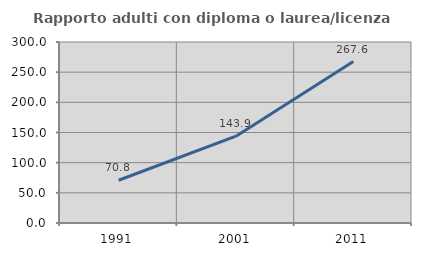
| Category | Rapporto adulti con diploma o laurea/licenza media  |
|---|---|
| 1991.0 | 70.833 |
| 2001.0 | 143.902 |
| 2011.0 | 267.568 |